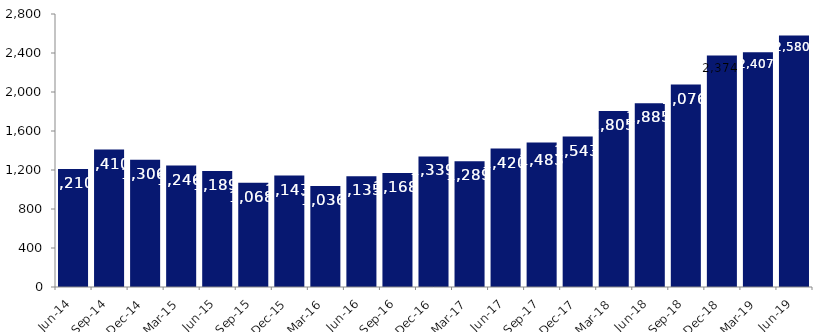
| Category | Series 0 |
|---|---|
| Jun-14 | 1210 |
| Sep-14 | 1410 |
| Dec-14 | 1306 |
| Mar-15 | 1246 |
| Jun-15 | 1189 |
| Sep-15 | 1068 |
| Dec-15 | 1143 |
| Mar-16 | 1036 |
| Jun-16 | 1135 |
| Sep-16 | 1168 |
| Dec-16 | 1339 |
| Mar-17 | 1289 |
| Jun-17 | 1420 |
| Sep-17 | 1483 |
| Dec-17 | 1543 |
| Mar-18 | 1805 |
| Jun-18 | 1885 |
| Sep-18 | 2076 |
| Dec-18 | 2374 |
| Mar-19 | 2407 |
| Jun-19 | 2580 |